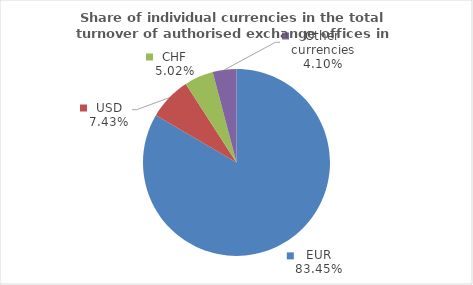
| Category | Series 0 |
|---|---|
| EUR | 83.448 |
| USD | 7.435 |
| CHF | 5.015 |
| Other currencies | 4.103 |